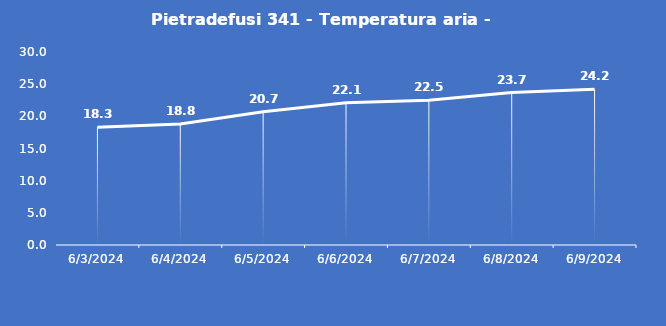
| Category | Pietradefusi 341 - Temperatura aria - Grezzo (°C) |
|---|---|
| 6/3/24 | 18.3 |
| 6/4/24 | 18.8 |
| 6/5/24 | 20.7 |
| 6/6/24 | 22.1 |
| 6/7/24 | 22.5 |
| 6/8/24 | 23.7 |
| 6/9/24 | 24.2 |